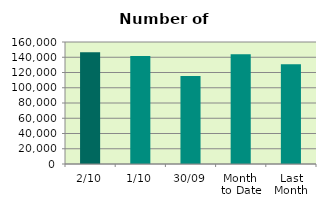
| Category | Series 0 |
|---|---|
| 2/10 | 146490 |
| 1/10 | 141484 |
| 30/09 | 115400 |
| Month 
to Date | 143987 |
| Last
Month | 130923.048 |